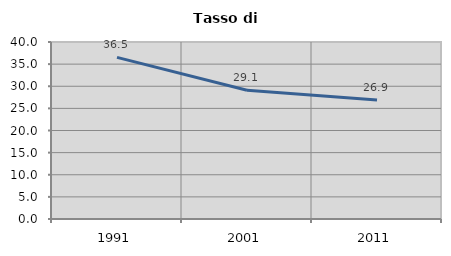
| Category | Tasso di disoccupazione   |
|---|---|
| 1991.0 | 36.518 |
| 2001.0 | 29.09 |
| 2011.0 | 26.879 |